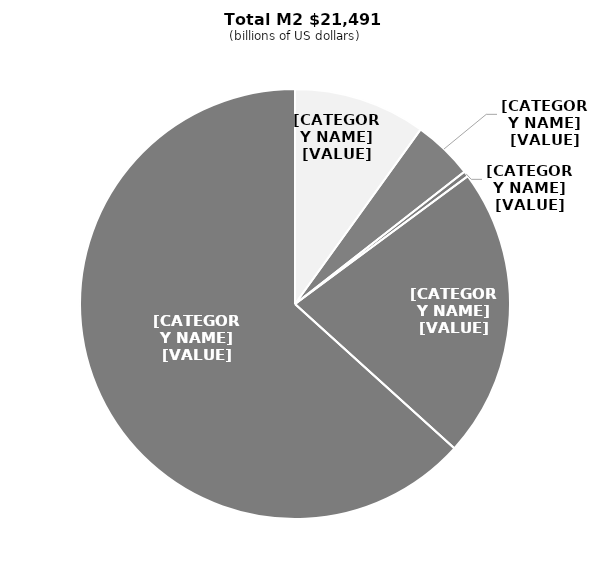
| Category | 2021 |
|---|---|
| Currency in circulation | 2133 |
| Retail money market funds | 972 |
| Small-time deposits | 88 |
| Demand deposits | 4697 |
| Other bank deposits | 13601 |